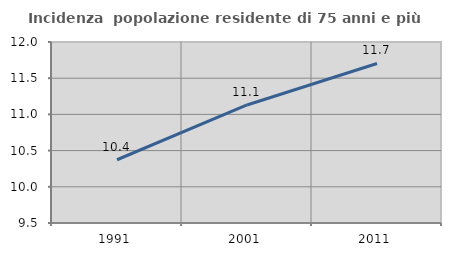
| Category | Incidenza  popolazione residente di 75 anni e più |
|---|---|
| 1991.0 | 10.374 |
| 2001.0 | 11.13 |
| 2011.0 | 11.703 |